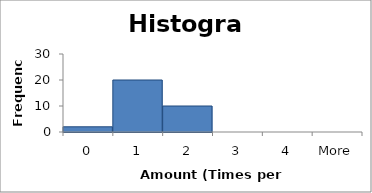
| Category | Frequency |
|---|---|
| 0 | 2 |
| 1 | 20 |
| 2 | 10 |
| 3 | 0 |
| 4 | 0 |
| More | 0 |